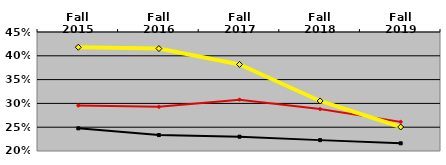
| Category | NATIONAL MEDIAN | WEST MEDIAN | TEXAS LUTHERAN |
|---|---|---|---|
| Fall 2015 | 0.248 | 0.296 | 0.418 |
| Fall 2016 | 0.233 | 0.293 | 0.415 |
| Fall 2017 | 0.23 | 0.308 | 0.382 |
| Fall 2018 | 0.223 | 0.288 | 0.305 |
| Fall 2019 | 0.216 | 0.261 | 0.25 |